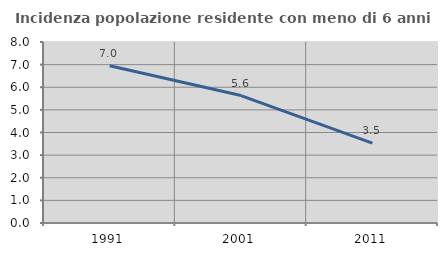
| Category | Incidenza popolazione residente con meno di 6 anni |
|---|---|
| 1991.0 | 6.954 |
| 2001.0 | 5.633 |
| 2011.0 | 3.528 |